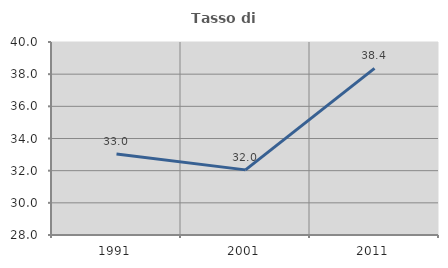
| Category | Tasso di occupazione   |
|---|---|
| 1991.0 | 33.038 |
| 2001.0 | 32.049 |
| 2011.0 | 38.36 |